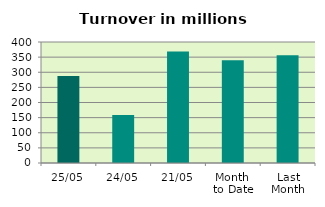
| Category | Series 0 |
|---|---|
| 25/05 | 287.303 |
| 24/05 | 158.715 |
| 21/05 | 368.799 |
| Month 
to Date | 339.963 |
| Last
Month | 356.105 |